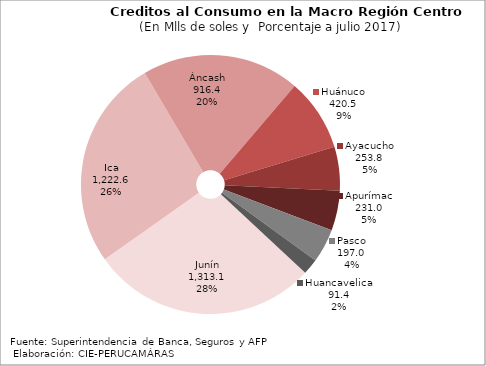
| Category | Series 0 |
|---|---|
| Junín | 1313.065 |
| Ica | 1222.618 |
| Áncash | 916.375 |
| Huánuco | 420.491 |
| Ayacucho | 253.753 |
| Apurímac | 230.996 |
| Pasco | 197.003 |
| Huancavelica | 91.406 |